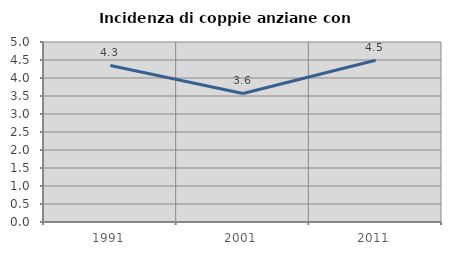
| Category | Incidenza di coppie anziane con figli |
|---|---|
| 1991.0 | 4.348 |
| 2001.0 | 3.571 |
| 2011.0 | 4.494 |